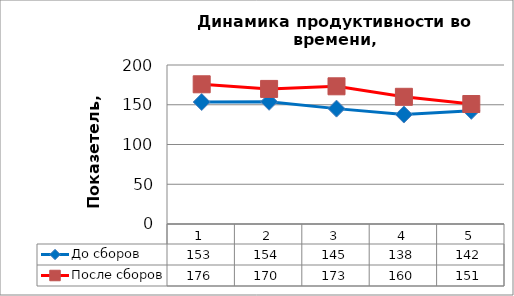
| Category | До сборов | После сборов |
|---|---|---|
| 0 | 153.421 | 175.739 |
| 1 | 153.725 | 169.918 |
| 2 | 145.116 | 173.208 |
| 3 | 137.677 | 160 |
| 4 | 142.347 | 150.909 |